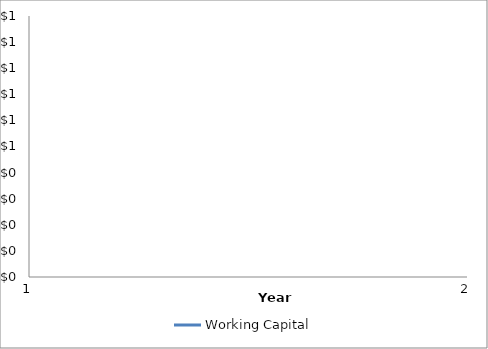
| Category | Working Capital |
|---|---|
| 0 | 0 |
| 1 | 0 |
| 2 | 0 |
| 3 | 0 |
| 4 | 0 |
| 5 | 0 |
| 6 | 0 |
| 7 | 0 |
| 8 | 0 |
| 9 | 0 |